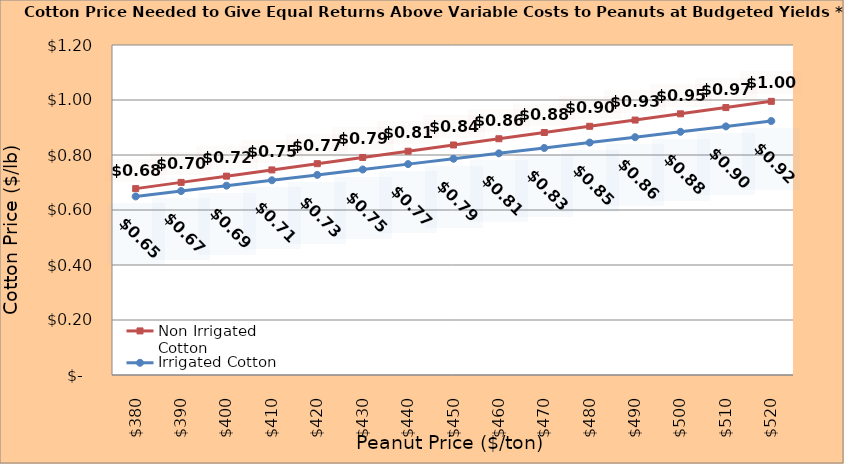
| Category | Non Irrigated Cotton | Irrigated Cotton |
|---|---|---|
| 380.0 | 0.678 | 0.649 |
| 390.0 | 0.7 | 0.669 |
| 400.0 | 0.723 | 0.689 |
| 410.0 | 0.746 | 0.708 |
| 420.0 | 0.768 | 0.728 |
| 430.0 | 0.791 | 0.747 |
| 440.0 | 0.814 | 0.767 |
| 450.0 | 0.836 | 0.786 |
| 460.0 | 0.859 | 0.806 |
| 470.0 | 0.882 | 0.826 |
| 480.0 | 0.904 | 0.845 |
| 490.0 | 0.927 | 0.865 |
| 500.0 | 0.95 | 0.884 |
| 510.0 | 0.972 | 0.904 |
| 520.0 | 0.995 | 0.924 |